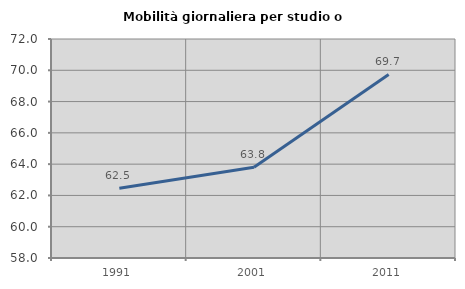
| Category | Mobilità giornaliera per studio o lavoro |
|---|---|
| 1991.0 | 62.462 |
| 2001.0 | 63.804 |
| 2011.0 | 69.735 |